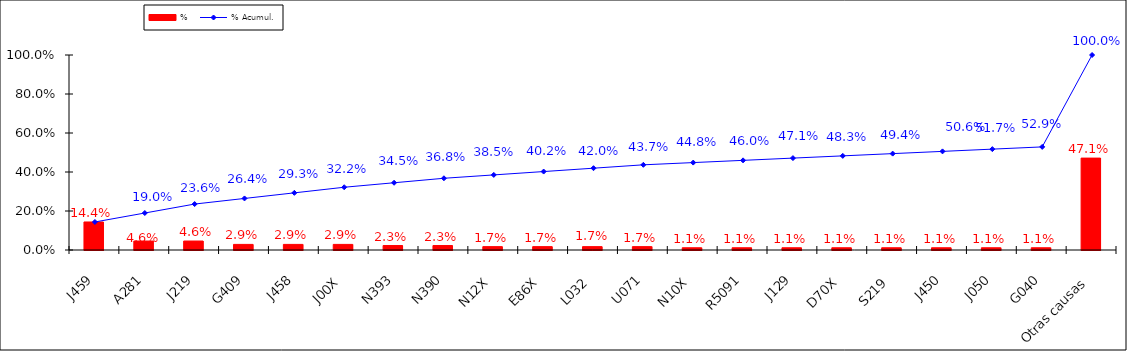
| Category | % |
|---|---|
| J459 | 0.144 |
| A281 | 0.046 |
| J219 | 0.046 |
| G409 | 0.029 |
| J458 | 0.029 |
| J00X | 0.029 |
| N393 | 0.023 |
| N390 | 0.023 |
| N12X | 0.017 |
| E86X | 0.017 |
| L032 | 0.017 |
| U071 | 0.017 |
| N10X | 0.011 |
| R5091 | 0.011 |
| J129 | 0.011 |
| D70X | 0.011 |
| S219 | 0.011 |
| J450 | 0.011 |
| J050 | 0.011 |
| G040 | 0.011 |
| Otras causas | 0.471 |